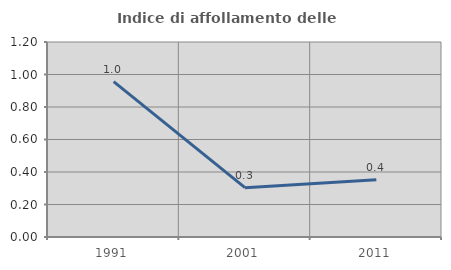
| Category | Indice di affollamento delle abitazioni  |
|---|---|
| 1991.0 | 0.956 |
| 2001.0 | 0.304 |
| 2011.0 | 0.352 |